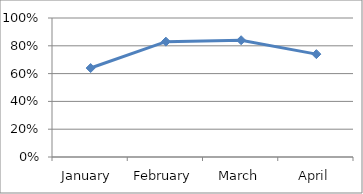
| Category | ACCURACY |
|---|---|
| January  | 0.64 |
| February | 0.83 |
| March | 0.84 |
| April | 0.74 |